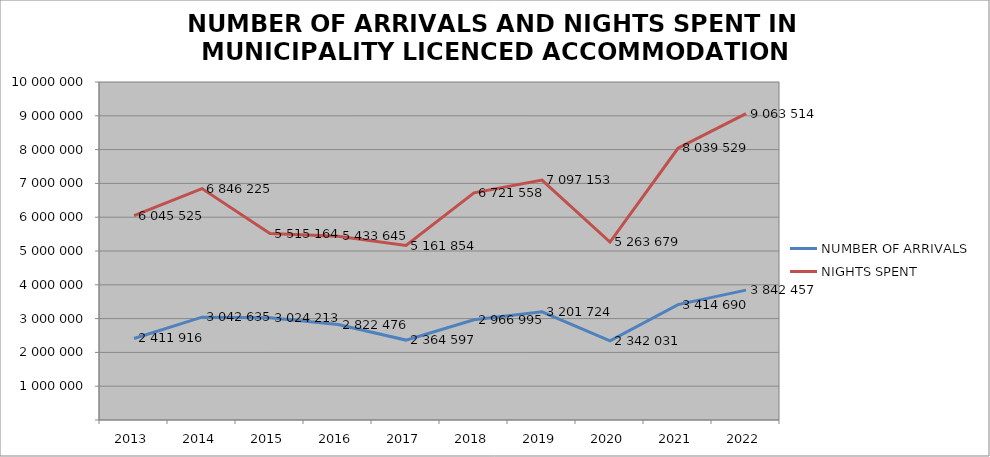
| Category | NUMBER OF ARRIVALS | NIGHTS SPENT |
|---|---|---|
| 2013 | 2411916 | 6045525 |
| 2014 | 3042635 | 6846225 |
| 2015 | 3024213 | 5515164 |
| 2016 | 2822476 | 5433645 |
| 2017 | 2364597 | 5161854 |
| 2018 | 2966995 | 6721558 |
| 2019 | 3201724 | 7097153 |
| 2020 | 2342031 | 5263679 |
| 2021 | 3414690 | 8039529 |
| 2022 | 3842457 | 9063514 |